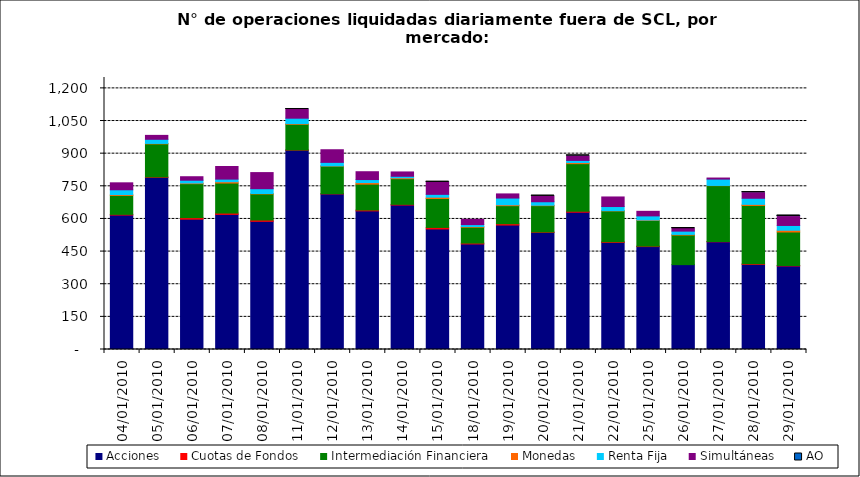
| Category | Acciones | Cuotas de Fondos | Intermediación Financiera | Monedas | Renta Fija | Simultáneas | AO |
|---|---|---|---|---|---|---|---|
| 04/01/2010 | 618 | 3 | 87 | 4 | 22 | 32 | 0 |
| 05/01/2010 | 791 | 2 | 152 | 2 | 19 | 18 | 0 |
| 06/01/2010 | 599 | 7 | 156 | 3 | 13 | 16 | 0 |
| 07/01/2010 | 621 | 6 | 138 | 6 | 12 | 58 | 0 |
| 08/01/2010 | 589 | 6 | 120 | 2 | 22 | 74 | 0 |
| 11/01/2010 | 916 | 1 | 118 | 3 | 25 | 40 | 2 |
| 12/01/2010 | 715 | 1 | 127 | 1 | 16 | 58 | 0 |
| 13/01/2010 | 637 | 4 | 119 | 7 | 14 | 36 | 0 |
| 14/01/2010 | 664 | 3 | 118 | 4 | 7 | 20 | 0 |
| 15/01/2010 | 554 | 7 | 133 | 6 | 13 | 56 | 1 |
| 18/01/2010 | 485 | 4 | 73 | 3 | 9 | 24 | 0 |
| 19/01/2010 | 572 | 6 | 83 | 4 | 31 | 19 | 0 |
| 20/01/2010 | 538 | 2 | 121 | 2 | 16 | 26 | 1 |
| 21/01/2010 | 631 | 4 | 219 | 5 | 10 | 21 | 1 |
| 22/01/2010 | 492 | 3 | 142 | 1 | 19 | 44 | 0 |
| 25/01/2010 | 473 | 2 | 118 | 2 | 19 | 21 | 0 |
| 26/01/2010 | 390 | 0 | 136 | 3 | 15 | 12 | 1 |
| 27/01/2010 | 495 | 1 | 257 | 1 | 29 | 5 | 0 |
| 28/01/2010 | 391 | 3 | 268 | 5 | 28 | 26 | 2 |
| 29/01/2010 | 384 | 2 | 154 | 8 | 22 | 41 | 5 |